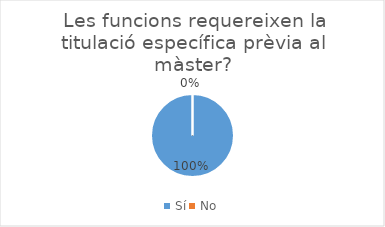
| Category | Series 0 |
|---|---|
| Sí | 4 |
| No | 0 |